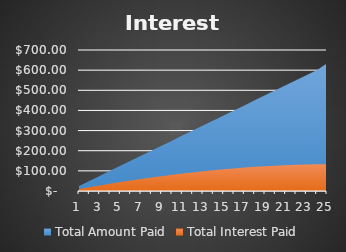
| Category | Total Amount Paid | Total Interest Paid |
|---|---|---|
| 0 | 25 | 9.425 |
| 1 | 50 | 18.556 |
| 2 | 75 | 27.389 |
| 3 | 100 | 35.916 |
| 4 | 125 | 44.133 |
| 5 | 150 | 52.034 |
| 6 | 175 | 59.612 |
| 7 | 200 | 66.862 |
| 8 | 225 | 73.778 |
| 9 | 250 | 80.352 |
| 10 | 275 | 86.579 |
| 11 | 300 | 92.452 |
| 12 | 325 | 97.965 |
| 13 | 350 | 103.111 |
| 14 | 375 | 107.882 |
| 15 | 400 | 112.271 |
| 16 | 425 | 116.273 |
| 17 | 450 | 119.878 |
| 18 | 475 | 123.08 |
| 19 | 500 | 125.872 |
| 20 | 525 | 128.244 |
| 21 | 550 | 130.191 |
| 22 | 575 | 131.702 |
| 23 | 600 | 132.771 |
| 24 | 633.389 | 133.389 |